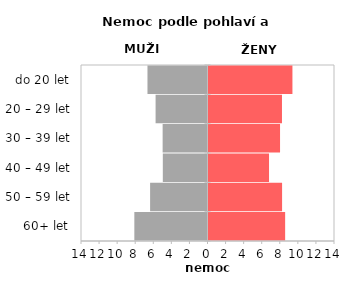
| Category | Nemoc |
|---|---|
| 60+ let | 8.482 |
| 50 – 59 let | 8.144 |
| 40 – 49 let | 6.699 |
| 30 – 39 let | 7.918 |
| 20 – 29 let | 8.132 |
| do 20 let | 9.289 |